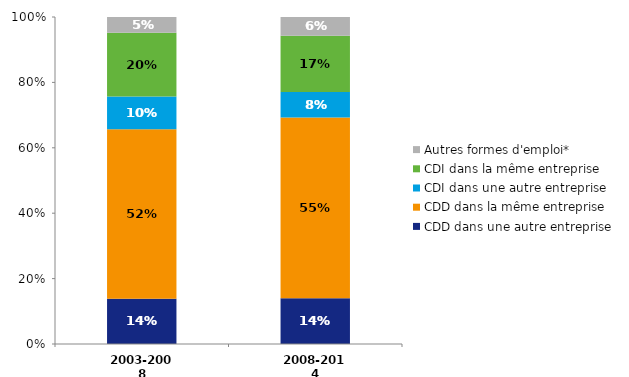
| Category | CDD dans une autre entreprise | CDD dans la même entreprise | CDI dans une autre entreprise | CDI dans la même entreprise | Autres formes d'emploi* |
|---|---|---|---|---|---|
| 2003-2008 | 0.138 | 0.518 | 0.1 | 0.195 | 0.048 |
| 2008-2014 | 0.14 | 0.553 | 0.078 | 0.172 | 0.058 |